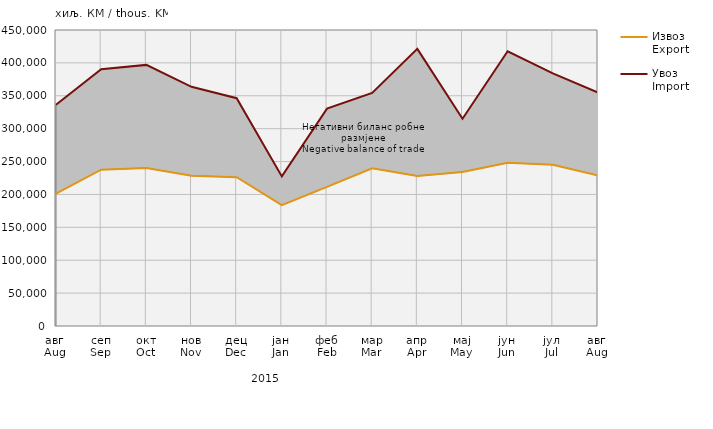
| Category | Извоз
Export | Увоз
Import |
|---|---|---|
| авг
Aug | 201367 | 336388 |
| сеп
Sep | 237597 | 390273 |
| окт
Oct | 240258 | 396961 |
| нов
Nov | 228539 | 363606 |
| дец
Dec | 226207 | 346357 |
| јан
Jan | 183778.801 | 227457.636 |
| феб
Feb | 211524.415 | 330458.834 |
| мар
Mar | 239782.217 | 354355.304 |
| апр
Apr | 228100.435 | 421365.337 |
| мај
May | 234235.846 | 315075.117 |
| јун
Jun | 248187.348 | 417597.833 |
| јул
Jul | 245140.792 | 384144.314 |
| авг
Aug | 228934.813 | 355007.703 |